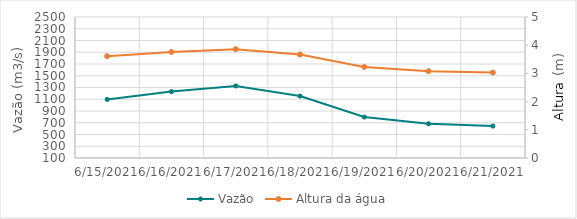
| Category | Vazão |
|---|---|
| 5/25/21 | 783.29 |
| 5/24/21 | 826.64 |
| 5/23/21 | 1106.29 |
| 5/22/21 | 1298.82 |
| 5/21/21 | 1465.3 |
| 5/20/21 | 1708.64 |
| 5/19/21 | 2041.13 |